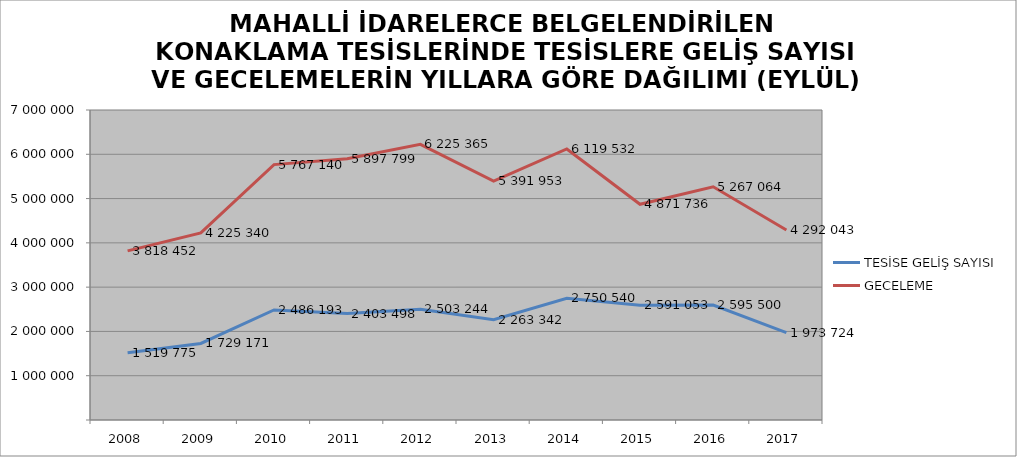
| Category | TESİSE GELİŞ SAYISI | GECELEME |
|---|---|---|
| 2008 | 1519775 | 3818452 |
| 2009 | 1729171 | 4225340 |
| 2010 | 2486193 | 5767140 |
| 2011 | 2403498 | 5897799 |
| 2012 | 2503244 | 6225365 |
| 2013 | 2263342 | 5391953 |
| 2014 | 2750540 | 6119532 |
| 2015 | 2591053 | 4871736 |
| 2016 | 2595500 | 5267064 |
| 2017 | 1973724 | 4292043 |